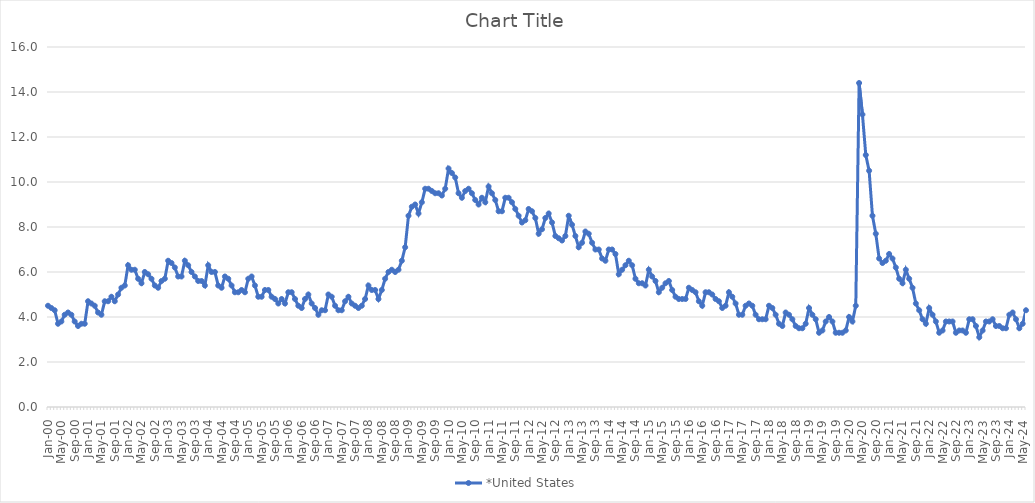
| Category | *United States | Alaska | Alabama | Arkansas | Arizona | California | Colorado | Connecticut | Delaware | Florida | Georgia | Hawaii | Iowa | Idaho | Illinois | Indiana | Kansas | Kentucky | Louisiana | Massachusetts | Maryland | Maine | Michigan | Minnesota | Missouri | Mississippi | Montana | North Carolina | North Dakota | Nebraska | New Hampshire | New Jersey | New Mexico | Nevada | New York | Ohio | Oklahoma | Oregon | Pennsylvania | Rhode Island | South Carolina | South Dakota | Tennessee | Texas | Utah | Virginia | Vermont | Washington | Wisconsin | West Virginia | Wyoming |
|---|---|---|---|---|---|---|---|---|---|---|---|---|---|---|---|---|---|---|---|---|---|---|---|---|---|---|---|---|---|---|---|---|---|---|---|---|---|---|---|---|---|---|---|---|---|---|---|---|---|---|---|
| Jan-00 | 4.5 |  |  |  |  |  |  |  |  |  |  |  |  |  |  |  |  |  |  |  |  |  |  |  |  |  |  |  |  |  |  |  |  |  |  |  |  |  |  |  |  |  |  |  |  |  |  |  |  |  |  |
| Feb-00 | 4.4 |  |  |  |  |  |  |  |  |  |  |  |  |  |  |  |  |  |  |  |  |  |  |  |  |  |  |  |  |  |  |  |  |  |  |  |  |  |  |  |  |  |  |  |  |  |  |  |  |  |  |
| Mar-00 | 4.3 |  |  |  |  |  |  |  |  |  |  |  |  |  |  |  |  |  |  |  |  |  |  |  |  |  |  |  |  |  |  |  |  |  |  |  |  |  |  |  |  |  |  |  |  |  |  |  |  |  |  |
| Apr-00 | 3.7 |  |  |  |  |  |  |  |  |  |  |  |  |  |  |  |  |  |  |  |  |  |  |  |  |  |  |  |  |  |  |  |  |  |  |  |  |  |  |  |  |  |  |  |  |  |  |  |  |  |  |
| May-00 | 3.8 |  |  |  |  |  |  |  |  |  |  |  |  |  |  |  |  |  |  |  |  |  |  |  |  |  |  |  |  |  |  |  |  |  |  |  |  |  |  |  |  |  |  |  |  |  |  |  |  |  |  |
| Jun-00 | 4.1 |  |  |  |  |  |  |  |  |  |  |  |  |  |  |  |  |  |  |  |  |  |  |  |  |  |  |  |  |  |  |  |  |  |  |  |  |  |  |  |  |  |  |  |  |  |  |  |  |  |  |
| Jul-00 | 4.2 |  |  |  |  |  |  |  |  |  |  |  |  |  |  |  |  |  |  |  |  |  |  |  |  |  |  |  |  |  |  |  |  |  |  |  |  |  |  |  |  |  |  |  |  |  |  |  |  |  |  |
| Aug-00 | 4.1 |  |  |  |  |  |  |  |  |  |  |  |  |  |  |  |  |  |  |  |  |  |  |  |  |  |  |  |  |  |  |  |  |  |  |  |  |  |  |  |  |  |  |  |  |  |  |  |  |  |  |
| Sep-00 | 3.8 |  |  |  |  |  |  |  |  |  |  |  |  |  |  |  |  |  |  |  |  |  |  |  |  |  |  |  |  |  |  |  |  |  |  |  |  |  |  |  |  |  |  |  |  |  |  |  |  |  |  |
| Oct-00 | 3.6 |  |  |  |  |  |  |  |  |  |  |  |  |  |  |  |  |  |  |  |  |  |  |  |  |  |  |  |  |  |  |  |  |  |  |  |  |  |  |  |  |  |  |  |  |  |  |  |  |  |  |
| Nov-00 | 3.7 |  |  |  |  |  |  |  |  |  |  |  |  |  |  |  |  |  |  |  |  |  |  |  |  |  |  |  |  |  |  |  |  |  |  |  |  |  |  |  |  |  |  |  |  |  |  |  |  |  |  |
| Dec-00 | 3.7 |  |  |  |  |  |  |  |  |  |  |  |  |  |  |  |  |  |  |  |  |  |  |  |  |  |  |  |  |  |  |  |  |  |  |  |  |  |  |  |  |  |  |  |  |  |  |  |  |  |  |
| Jan-01 | 4.7 |  |  |  |  |  |  |  |  |  |  |  |  |  |  |  |  |  |  |  |  |  |  |  |  |  |  |  |  |  |  |  |  |  |  |  |  |  |  |  |  |  |  |  |  |  |  |  |  |  |  |
| Feb-01 | 4.6 |  |  |  |  |  |  |  |  |  |  |  |  |  |  |  |  |  |  |  |  |  |  |  |  |  |  |  |  |  |  |  |  |  |  |  |  |  |  |  |  |  |  |  |  |  |  |  |  |  |  |
| Mar-01 | 4.5 |  |  |  |  |  |  |  |  |  |  |  |  |  |  |  |  |  |  |  |  |  |  |  |  |  |  |  |  |  |  |  |  |  |  |  |  |  |  |  |  |  |  |  |  |  |  |  |  |  |  |
| Apr-01 | 4.2 |  |  |  |  |  |  |  |  |  |  |  |  |  |  |  |  |  |  |  |  |  |  |  |  |  |  |  |  |  |  |  |  |  |  |  |  |  |  |  |  |  |  |  |  |  |  |  |  |  |  |
| May-01 | 4.1 |  |  |  |  |  |  |  |  |  |  |  |  |  |  |  |  |  |  |  |  |  |  |  |  |  |  |  |  |  |  |  |  |  |  |  |  |  |  |  |  |  |  |  |  |  |  |  |  |  |  |
| Jun-01 | 4.7 |  |  |  |  |  |  |  |  |  |  |  |  |  |  |  |  |  |  |  |  |  |  |  |  |  |  |  |  |  |  |  |  |  |  |  |  |  |  |  |  |  |  |  |  |  |  |  |  |  |  |
| Jul-01 | 4.7 |  |  |  |  |  |  |  |  |  |  |  |  |  |  |  |  |  |  |  |  |  |  |  |  |  |  |  |  |  |  |  |  |  |  |  |  |  |  |  |  |  |  |  |  |  |  |  |  |  |  |
| Aug-01 | 4.9 |  |  |  |  |  |  |  |  |  |  |  |  |  |  |  |  |  |  |  |  |  |  |  |  |  |  |  |  |  |  |  |  |  |  |  |  |  |  |  |  |  |  |  |  |  |  |  |  |  |  |
| Sep-01 | 4.7 |  |  |  |  |  |  |  |  |  |  |  |  |  |  |  |  |  |  |  |  |  |  |  |  |  |  |  |  |  |  |  |  |  |  |  |  |  |  |  |  |  |  |  |  |  |  |  |  |  |  |
| Oct-01 | 5 |  |  |  |  |  |  |  |  |  |  |  |  |  |  |  |  |  |  |  |  |  |  |  |  |  |  |  |  |  |  |  |  |  |  |  |  |  |  |  |  |  |  |  |  |  |  |  |  |  |  |
| Nov-01 | 5.3 |  |  |  |  |  |  |  |  |  |  |  |  |  |  |  |  |  |  |  |  |  |  |  |  |  |  |  |  |  |  |  |  |  |  |  |  |  |  |  |  |  |  |  |  |  |  |  |  |  |  |
| Dec-01 | 5.4 |  |  |  |  |  |  |  |  |  |  |  |  |  |  |  |  |  |  |  |  |  |  |  |  |  |  |  |  |  |  |  |  |  |  |  |  |  |  |  |  |  |  |  |  |  |  |  |  |  |  |
| Jan-02 | 6.3 |  |  |  |  |  |  |  |  |  |  |  |  |  |  |  |  |  |  |  |  |  |  |  |  |  |  |  |  |  |  |  |  |  |  |  |  |  |  |  |  |  |  |  |  |  |  |  |  |  |  |
| Feb-02 | 6.1 |  |  |  |  |  |  |  |  |  |  |  |  |  |  |  |  |  |  |  |  |  |  |  |  |  |  |  |  |  |  |  |  |  |  |  |  |  |  |  |  |  |  |  |  |  |  |  |  |  |  |
| Mar-02 | 6.1 |  |  |  |  |  |  |  |  |  |  |  |  |  |  |  |  |  |  |  |  |  |  |  |  |  |  |  |  |  |  |  |  |  |  |  |  |  |  |  |  |  |  |  |  |  |  |  |  |  |  |
| Apr-02 | 5.7 |  |  |  |  |  |  |  |  |  |  |  |  |  |  |  |  |  |  |  |  |  |  |  |  |  |  |  |  |  |  |  |  |  |  |  |  |  |  |  |  |  |  |  |  |  |  |  |  |  |  |
| May-02 | 5.5 |  |  |  |  |  |  |  |  |  |  |  |  |  |  |  |  |  |  |  |  |  |  |  |  |  |  |  |  |  |  |  |  |  |  |  |  |  |  |  |  |  |  |  |  |  |  |  |  |  |  |
| Jun-02 | 6 |  |  |  |  |  |  |  |  |  |  |  |  |  |  |  |  |  |  |  |  |  |  |  |  |  |  |  |  |  |  |  |  |  |  |  |  |  |  |  |  |  |  |  |  |  |  |  |  |  |  |
| Jul-02 | 5.9 |  |  |  |  |  |  |  |  |  |  |  |  |  |  |  |  |  |  |  |  |  |  |  |  |  |  |  |  |  |  |  |  |  |  |  |  |  |  |  |  |  |  |  |  |  |  |  |  |  |  |
| Aug-02 | 5.7 |  |  |  |  |  |  |  |  |  |  |  |  |  |  |  |  |  |  |  |  |  |  |  |  |  |  |  |  |  |  |  |  |  |  |  |  |  |  |  |  |  |  |  |  |  |  |  |  |  |  |
| Sep-02 | 5.4 |  |  |  |  |  |  |  |  |  |  |  |  |  |  |  |  |  |  |  |  |  |  |  |  |  |  |  |  |  |  |  |  |  |  |  |  |  |  |  |  |  |  |  |  |  |  |  |  |  |  |
| Oct-02 | 5.3 |  |  |  |  |  |  |  |  |  |  |  |  |  |  |  |  |  |  |  |  |  |  |  |  |  |  |  |  |  |  |  |  |  |  |  |  |  |  |  |  |  |  |  |  |  |  |  |  |  |  |
| Nov-02 | 5.6 |  |  |  |  |  |  |  |  |  |  |  |  |  |  |  |  |  |  |  |  |  |  |  |  |  |  |  |  |  |  |  |  |  |  |  |  |  |  |  |  |  |  |  |  |  |  |  |  |  |  |
| Dec-02 | 5.7 |  |  |  |  |  |  |  |  |  |  |  |  |  |  |  |  |  |  |  |  |  |  |  |  |  |  |  |  |  |  |  |  |  |  |  |  |  |  |  |  |  |  |  |  |  |  |  |  |  |  |
| Jan-03 | 6.5 |  |  |  |  |  |  |  |  |  |  |  |  |  |  |  |  |  |  |  |  |  |  |  |  |  |  |  |  |  |  |  |  |  |  |  |  |  |  |  |  |  |  |  |  |  |  |  |  |  |  |
| Feb-03 | 6.4 |  |  |  |  |  |  |  |  |  |  |  |  |  |  |  |  |  |  |  |  |  |  |  |  |  |  |  |  |  |  |  |  |  |  |  |  |  |  |  |  |  |  |  |  |  |  |  |  |  |  |
| Mar-03 | 6.2 |  |  |  |  |  |  |  |  |  |  |  |  |  |  |  |  |  |  |  |  |  |  |  |  |  |  |  |  |  |  |  |  |  |  |  |  |  |  |  |  |  |  |  |  |  |  |  |  |  |  |
| Apr-03 | 5.8 |  |  |  |  |  |  |  |  |  |  |  |  |  |  |  |  |  |  |  |  |  |  |  |  |  |  |  |  |  |  |  |  |  |  |  |  |  |  |  |  |  |  |  |  |  |  |  |  |  |  |
| May-03 | 5.8 |  |  |  |  |  |  |  |  |  |  |  |  |  |  |  |  |  |  |  |  |  |  |  |  |  |  |  |  |  |  |  |  |  |  |  |  |  |  |  |  |  |  |  |  |  |  |  |  |  |  |
| Jun-03 | 6.5 |  |  |  |  |  |  |  |  |  |  |  |  |  |  |  |  |  |  |  |  |  |  |  |  |  |  |  |  |  |  |  |  |  |  |  |  |  |  |  |  |  |  |  |  |  |  |  |  |  |  |
| Jul-03 | 6.3 |  |  |  |  |  |  |  |  |  |  |  |  |  |  |  |  |  |  |  |  |  |  |  |  |  |  |  |  |  |  |  |  |  |  |  |  |  |  |  |  |  |  |  |  |  |  |  |  |  |  |
| Aug-03 | 6 |  |  |  |  |  |  |  |  |  |  |  |  |  |  |  |  |  |  |  |  |  |  |  |  |  |  |  |  |  |  |  |  |  |  |  |  |  |  |  |  |  |  |  |  |  |  |  |  |  |  |
| Sep-03 | 5.8 |  |  |  |  |  |  |  |  |  |  |  |  |  |  |  |  |  |  |  |  |  |  |  |  |  |  |  |  |  |  |  |  |  |  |  |  |  |  |  |  |  |  |  |  |  |  |  |  |  |  |
| Oct-03 | 5.6 |  |  |  |  |  |  |  |  |  |  |  |  |  |  |  |  |  |  |  |  |  |  |  |  |  |  |  |  |  |  |  |  |  |  |  |  |  |  |  |  |  |  |  |  |  |  |  |  |  |  |
| Nov-03 | 5.6 |  |  |  |  |  |  |  |  |  |  |  |  |  |  |  |  |  |  |  |  |  |  |  |  |  |  |  |  |  |  |  |  |  |  |  |  |  |  |  |  |  |  |  |  |  |  |  |  |  |  |
| Dec-03 | 5.4 |  |  |  |  |  |  |  |  |  |  |  |  |  |  |  |  |  |  |  |  |  |  |  |  |  |  |  |  |  |  |  |  |  |  |  |  |  |  |  |  |  |  |  |  |  |  |  |  |  |  |
| Jan-04 | 6.3 |  |  |  |  |  |  |  |  |  |  |  |  |  |  |  |  |  |  |  |  |  |  |  |  |  |  |  |  |  |  |  |  |  |  |  |  |  |  |  |  |  |  |  |  |  |  |  |  |  |  |
| Feb-04 | 6 |  |  |  |  |  |  |  |  |  |  |  |  |  |  |  |  |  |  |  |  |  |  |  |  |  |  |  |  |  |  |  |  |  |  |  |  |  |  |  |  |  |  |  |  |  |  |  |  |  |  |
| Mar-04 | 6 |  |  |  |  |  |  |  |  |  |  |  |  |  |  |  |  |  |  |  |  |  |  |  |  |  |  |  |  |  |  |  |  |  |  |  |  |  |  |  |  |  |  |  |  |  |  |  |  |  |  |
| Apr-04 | 5.4 |  |  |  |  |  |  |  |  |  |  |  |  |  |  |  |  |  |  |  |  |  |  |  |  |  |  |  |  |  |  |  |  |  |  |  |  |  |  |  |  |  |  |  |  |  |  |  |  |  |  |
| May-04 | 5.3 |  |  |  |  |  |  |  |  |  |  |  |  |  |  |  |  |  |  |  |  |  |  |  |  |  |  |  |  |  |  |  |  |  |  |  |  |  |  |  |  |  |  |  |  |  |  |  |  |  |  |
| Jun-04 | 5.8 |  |  |  |  |  |  |  |  |  |  |  |  |  |  |  |  |  |  |  |  |  |  |  |  |  |  |  |  |  |  |  |  |  |  |  |  |  |  |  |  |  |  |  |  |  |  |  |  |  |  |
| Jul-04 | 5.7 |  |  |  |  |  |  |  |  |  |  |  |  |  |  |  |  |  |  |  |  |  |  |  |  |  |  |  |  |  |  |  |  |  |  |  |  |  |  |  |  |  |  |  |  |  |  |  |  |  |  |
| Aug-04 | 5.4 |  |  |  |  |  |  |  |  |  |  |  |  |  |  |  |  |  |  |  |  |  |  |  |  |  |  |  |  |  |  |  |  |  |  |  |  |  |  |  |  |  |  |  |  |  |  |  |  |  |  |
| Sep-04 | 5.1 |  |  |  |  |  |  |  |  |  |  |  |  |  |  |  |  |  |  |  |  |  |  |  |  |  |  |  |  |  |  |  |  |  |  |  |  |  |  |  |  |  |  |  |  |  |  |  |  |  |  |
| Oct-04 | 5.1 |  |  |  |  |  |  |  |  |  |  |  |  |  |  |  |  |  |  |  |  |  |  |  |  |  |  |  |  |  |  |  |  |  |  |  |  |  |  |  |  |  |  |  |  |  |  |  |  |  |  |
| Nov-04 | 5.2 |  |  |  |  |  |  |  |  |  |  |  |  |  |  |  |  |  |  |  |  |  |  |  |  |  |  |  |  |  |  |  |  |  |  |  |  |  |  |  |  |  |  |  |  |  |  |  |  |  |  |
| Dec-04 | 5.1 |  |  |  |  |  |  |  |  |  |  |  |  |  |  |  |  |  |  |  |  |  |  |  |  |  |  |  |  |  |  |  |  |  |  |  |  |  |  |  |  |  |  |  |  |  |  |  |  |  |  |
| Jan-05 | 5.7 |  |  |  |  |  |  |  |  |  |  |  |  |  |  |  |  |  |  |  |  |  |  |  |  |  |  |  |  |  |  |  |  |  |  |  |  |  |  |  |  |  |  |  |  |  |  |  |  |  |  |
| Feb-05 | 5.8 |  |  |  |  |  |  |  |  |  |  |  |  |  |  |  |  |  |  |  |  |  |  |  |  |  |  |  |  |  |  |  |  |  |  |  |  |  |  |  |  |  |  |  |  |  |  |  |  |  |  |
| Mar-05 | 5.4 |  |  |  |  |  |  |  |  |  |  |  |  |  |  |  |  |  |  |  |  |  |  |  |  |  |  |  |  |  |  |  |  |  |  |  |  |  |  |  |  |  |  |  |  |  |  |  |  |  |  |
| Apr-05 | 4.9 |  |  |  |  |  |  |  |  |  |  |  |  |  |  |  |  |  |  |  |  |  |  |  |  |  |  |  |  |  |  |  |  |  |  |  |  |  |  |  |  |  |  |  |  |  |  |  |  |  |  |
| May-05 | 4.9 |  |  |  |  |  |  |  |  |  |  |  |  |  |  |  |  |  |  |  |  |  |  |  |  |  |  |  |  |  |  |  |  |  |  |  |  |  |  |  |  |  |  |  |  |  |  |  |  |  |  |
| Jun-05 | 5.2 |  |  |  |  |  |  |  |  |  |  |  |  |  |  |  |  |  |  |  |  |  |  |  |  |  |  |  |  |  |  |  |  |  |  |  |  |  |  |  |  |  |  |  |  |  |  |  |  |  |  |
| Jul-05 | 5.2 |  |  |  |  |  |  |  |  |  |  |  |  |  |  |  |  |  |  |  |  |  |  |  |  |  |  |  |  |  |  |  |  |  |  |  |  |  |  |  |  |  |  |  |  |  |  |  |  |  |  |
| Aug-05 | 4.9 |  |  |  |  |  |  |  |  |  |  |  |  |  |  |  |  |  |  |  |  |  |  |  |  |  |  |  |  |  |  |  |  |  |  |  |  |  |  |  |  |  |  |  |  |  |  |  |  |  |  |
| Sep-05 | 4.8 |  |  |  |  |  |  |  |  |  |  |  |  |  |  |  |  |  |  |  |  |  |  |  |  |  |  |  |  |  |  |  |  |  |  |  |  |  |  |  |  |  |  |  |  |  |  |  |  |  |  |
| Oct-05 | 4.6 |  |  |  |  |  |  |  |  |  |  |  |  |  |  |  |  |  |  |  |  |  |  |  |  |  |  |  |  |  |  |  |  |  |  |  |  |  |  |  |  |  |  |  |  |  |  |  |  |  |  |
| Nov-05 | 4.8 |  |  |  |  |  |  |  |  |  |  |  |  |  |  |  |  |  |  |  |  |  |  |  |  |  |  |  |  |  |  |  |  |  |  |  |  |  |  |  |  |  |  |  |  |  |  |  |  |  |  |
| Dec-05 | 4.6 |  |  |  |  |  |  |  |  |  |  |  |  |  |  |  |  |  |  |  |  |  |  |  |  |  |  |  |  |  |  |  |  |  |  |  |  |  |  |  |  |  |  |  |  |  |  |  |  |  |  |
| Jan-06 | 5.1 |  |  |  |  |  |  |  |  |  |  |  |  |  |  |  |  |  |  |  |  |  |  |  |  |  |  |  |  |  |  |  |  |  |  |  |  |  |  |  |  |  |  |  |  |  |  |  |  |  |  |
| Feb-06 | 5.1 |  |  |  |  |  |  |  |  |  |  |  |  |  |  |  |  |  |  |  |  |  |  |  |  |  |  |  |  |  |  |  |  |  |  |  |  |  |  |  |  |  |  |  |  |  |  |  |  |  |  |
| Mar-06 | 4.8 |  |  |  |  |  |  |  |  |  |  |  |  |  |  |  |  |  |  |  |  |  |  |  |  |  |  |  |  |  |  |  |  |  |  |  |  |  |  |  |  |  |  |  |  |  |  |  |  |  |  |
| Apr-06 | 4.5 |  |  |  |  |  |  |  |  |  |  |  |  |  |  |  |  |  |  |  |  |  |  |  |  |  |  |  |  |  |  |  |  |  |  |  |  |  |  |  |  |  |  |  |  |  |  |  |  |  |  |
| May-06 | 4.4 |  |  |  |  |  |  |  |  |  |  |  |  |  |  |  |  |  |  |  |  |  |  |  |  |  |  |  |  |  |  |  |  |  |  |  |  |  |  |  |  |  |  |  |  |  |  |  |  |  |  |
| Jun-06 | 4.8 |  |  |  |  |  |  |  |  |  |  |  |  |  |  |  |  |  |  |  |  |  |  |  |  |  |  |  |  |  |  |  |  |  |  |  |  |  |  |  |  |  |  |  |  |  |  |  |  |  |  |
| Jul-06 | 5 |  |  |  |  |  |  |  |  |  |  |  |  |  |  |  |  |  |  |  |  |  |  |  |  |  |  |  |  |  |  |  |  |  |  |  |  |  |  |  |  |  |  |  |  |  |  |  |  |  |  |
| Aug-06 | 4.6 |  |  |  |  |  |  |  |  |  |  |  |  |  |  |  |  |  |  |  |  |  |  |  |  |  |  |  |  |  |  |  |  |  |  |  |  |  |  |  |  |  |  |  |  |  |  |  |  |  |  |
| Sep-06 | 4.4 |  |  |  |  |  |  |  |  |  |  |  |  |  |  |  |  |  |  |  |  |  |  |  |  |  |  |  |  |  |  |  |  |  |  |  |  |  |  |  |  |  |  |  |  |  |  |  |  |  |  |
| Oct-06 | 4.1 |  |  |  |  |  |  |  |  |  |  |  |  |  |  |  |  |  |  |  |  |  |  |  |  |  |  |  |  |  |  |  |  |  |  |  |  |  |  |  |  |  |  |  |  |  |  |  |  |  |  |
| Nov-06 | 4.3 |  |  |  |  |  |  |  |  |  |  |  |  |  |  |  |  |  |  |  |  |  |  |  |  |  |  |  |  |  |  |  |  |  |  |  |  |  |  |  |  |  |  |  |  |  |  |  |  |  |  |
| Dec-06 | 4.3 |  |  |  |  |  |  |  |  |  |  |  |  |  |  |  |  |  |  |  |  |  |  |  |  |  |  |  |  |  |  |  |  |  |  |  |  |  |  |  |  |  |  |  |  |  |  |  |  |  |  |
| Jan-07 | 5 |  |  |  |  |  |  |  |  |  |  |  |  |  |  |  |  |  |  |  |  |  |  |  |  |  |  |  |  |  |  |  |  |  |  |  |  |  |  |  |  |  |  |  |  |  |  |  |  |  |  |
| Feb-07 | 4.9 |  |  |  |  |  |  |  |  |  |  |  |  |  |  |  |  |  |  |  |  |  |  |  |  |  |  |  |  |  |  |  |  |  |  |  |  |  |  |  |  |  |  |  |  |  |  |  |  |  |  |
| Mar-07 | 4.5 |  |  |  |  |  |  |  |  |  |  |  |  |  |  |  |  |  |  |  |  |  |  |  |  |  |  |  |  |  |  |  |  |  |  |  |  |  |  |  |  |  |  |  |  |  |  |  |  |  |  |
| Apr-07 | 4.3 |  |  |  |  |  |  |  |  |  |  |  |  |  |  |  |  |  |  |  |  |  |  |  |  |  |  |  |  |  |  |  |  |  |  |  |  |  |  |  |  |  |  |  |  |  |  |  |  |  |  |
| May-07 | 4.3 |  |  |  |  |  |  |  |  |  |  |  |  |  |  |  |  |  |  |  |  |  |  |  |  |  |  |  |  |  |  |  |  |  |  |  |  |  |  |  |  |  |  |  |  |  |  |  |  |  |  |
| Jun-07 | 4.7 |  |  |  |  |  |  |  |  |  |  |  |  |  |  |  |  |  |  |  |  |  |  |  |  |  |  |  |  |  |  |  |  |  |  |  |  |  |  |  |  |  |  |  |  |  |  |  |  |  |  |
| Jul-07 | 4.9 |  |  |  |  |  |  |  |  |  |  |  |  |  |  |  |  |  |  |  |  |  |  |  |  |  |  |  |  |  |  |  |  |  |  |  |  |  |  |  |  |  |  |  |  |  |  |  |  |  |  |
| Aug-07 | 4.6 |  |  |  |  |  |  |  |  |  |  |  |  |  |  |  |  |  |  |  |  |  |  |  |  |  |  |  |  |  |  |  |  |  |  |  |  |  |  |  |  |  |  |  |  |  |  |  |  |  |  |
| Sep-07 | 4.5 |  |  |  |  |  |  |  |  |  |  |  |  |  |  |  |  |  |  |  |  |  |  |  |  |  |  |  |  |  |  |  |  |  |  |  |  |  |  |  |  |  |  |  |  |  |  |  |  |  |  |
| Oct-07 | 4.4 |  |  |  |  |  |  |  |  |  |  |  |  |  |  |  |  |  |  |  |  |  |  |  |  |  |  |  |  |  |  |  |  |  |  |  |  |  |  |  |  |  |  |  |  |  |  |  |  |  |  |
| Nov-07 | 4.5 |  |  |  |  |  |  |  |  |  |  |  |  |  |  |  |  |  |  |  |  |  |  |  |  |  |  |  |  |  |  |  |  |  |  |  |  |  |  |  |  |  |  |  |  |  |  |  |  |  |  |
| Dec-07 | 4.8 |  |  |  |  |  |  |  |  |  |  |  |  |  |  |  |  |  |  |  |  |  |  |  |  |  |  |  |  |  |  |  |  |  |  |  |  |  |  |  |  |  |  |  |  |  |  |  |  |  |  |
| Jan-08 | 5.4 |  |  |  |  |  |  |  |  |  |  |  |  |  |  |  |  |  |  |  |  |  |  |  |  |  |  |  |  |  |  |  |  |  |  |  |  |  |  |  |  |  |  |  |  |  |  |  |  |  |  |
| Feb-08 | 5.2 |  |  |  |  |  |  |  |  |  |  |  |  |  |  |  |  |  |  |  |  |  |  |  |  |  |  |  |  |  |  |  |  |  |  |  |  |  |  |  |  |  |  |  |  |  |  |  |  |  |  |
| Mar-08 | 5.2 |  |  |  |  |  |  |  |  |  |  |  |  |  |  |  |  |  |  |  |  |  |  |  |  |  |  |  |  |  |  |  |  |  |  |  |  |  |  |  |  |  |  |  |  |  |  |  |  |  |  |
| Apr-08 | 4.8 |  |  |  |  |  |  |  |  |  |  |  |  |  |  |  |  |  |  |  |  |  |  |  |  |  |  |  |  |  |  |  |  |  |  |  |  |  |  |  |  |  |  |  |  |  |  |  |  |  |  |
| May-08 | 5.2 |  |  |  |  |  |  |  |  |  |  |  |  |  |  |  |  |  |  |  |  |  |  |  |  |  |  |  |  |  |  |  |  |  |  |  |  |  |  |  |  |  |  |  |  |  |  |  |  |  |  |
| Jun-08 | 5.7 |  |  |  |  |  |  |  |  |  |  |  |  |  |  |  |  |  |  |  |  |  |  |  |  |  |  |  |  |  |  |  |  |  |  |  |  |  |  |  |  |  |  |  |  |  |  |  |  |  |  |
| Jul-08 | 6 |  |  |  |  |  |  |  |  |  |  |  |  |  |  |  |  |  |  |  |  |  |  |  |  |  |  |  |  |  |  |  |  |  |  |  |  |  |  |  |  |  |  |  |  |  |  |  |  |  |  |
| Aug-08 | 6.1 |  |  |  |  |  |  |  |  |  |  |  |  |  |  |  |  |  |  |  |  |  |  |  |  |  |  |  |  |  |  |  |  |  |  |  |  |  |  |  |  |  |  |  |  |  |  |  |  |  |  |
| Sep-08 | 6 |  |  |  |  |  |  |  |  |  |  |  |  |  |  |  |  |  |  |  |  |  |  |  |  |  |  |  |  |  |  |  |  |  |  |  |  |  |  |  |  |  |  |  |  |  |  |  |  |  |  |
| Oct-08 | 6.1 |  |  |  |  |  |  |  |  |  |  |  |  |  |  |  |  |  |  |  |  |  |  |  |  |  |  |  |  |  |  |  |  |  |  |  |  |  |  |  |  |  |  |  |  |  |  |  |  |  |  |
| Nov-08 | 6.5 |  |  |  |  |  |  |  |  |  |  |  |  |  |  |  |  |  |  |  |  |  |  |  |  |  |  |  |  |  |  |  |  |  |  |  |  |  |  |  |  |  |  |  |  |  |  |  |  |  |  |
| Dec-08 | 7.1 |  |  |  |  |  |  |  |  |  |  |  |  |  |  |  |  |  |  |  |  |  |  |  |  |  |  |  |  |  |  |  |  |  |  |  |  |  |  |  |  |  |  |  |  |  |  |  |  |  |  |
| Jan-09 | 8.5 |  |  |  |  |  |  |  |  |  |  |  |  |  |  |  |  |  |  |  |  |  |  |  |  |  |  |  |  |  |  |  |  |  |  |  |  |  |  |  |  |  |  |  |  |  |  |  |  |  |  |
| Feb-09 | 8.9 |  |  |  |  |  |  |  |  |  |  |  |  |  |  |  |  |  |  |  |  |  |  |  |  |  |  |  |  |  |  |  |  |  |  |  |  |  |  |  |  |  |  |  |  |  |  |  |  |  |  |
| Mar-09 | 9 |  |  |  |  |  |  |  |  |  |  |  |  |  |  |  |  |  |  |  |  |  |  |  |  |  |  |  |  |  |  |  |  |  |  |  |  |  |  |  |  |  |  |  |  |  |  |  |  |  |  |
| Apr-09 | 8.6 |  |  |  |  |  |  |  |  |  |  |  |  |  |  |  |  |  |  |  |  |  |  |  |  |  |  |  |  |  |  |  |  |  |  |  |  |  |  |  |  |  |  |  |  |  |  |  |  |  |  |
| May-09 | 9.1 |  |  |  |  |  |  |  |  |  |  |  |  |  |  |  |  |  |  |  |  |  |  |  |  |  |  |  |  |  |  |  |  |  |  |  |  |  |  |  |  |  |  |  |  |  |  |  |  |  |  |
| Jun-09 | 9.7 |  |  |  |  |  |  |  |  |  |  |  |  |  |  |  |  |  |  |  |  |  |  |  |  |  |  |  |  |  |  |  |  |  |  |  |  |  |  |  |  |  |  |  |  |  |  |  |  |  |  |
| Jul-09 | 9.7 |  |  |  |  |  |  |  |  |  |  |  |  |  |  |  |  |  |  |  |  |  |  |  |  |  |  |  |  |  |  |  |  |  |  |  |  |  |  |  |  |  |  |  |  |  |  |  |  |  |  |
| Aug-09 | 9.6 |  |  |  |  |  |  |  |  |  |  |  |  |  |  |  |  |  |  |  |  |  |  |  |  |  |  |  |  |  |  |  |  |  |  |  |  |  |  |  |  |  |  |  |  |  |  |  |  |  |  |
| Sep-09 | 9.5 |  |  |  |  |  |  |  |  |  |  |  |  |  |  |  |  |  |  |  |  |  |  |  |  |  |  |  |  |  |  |  |  |  |  |  |  |  |  |  |  |  |  |  |  |  |  |  |  |  |  |
| Oct-09 | 9.5 |  |  |  |  |  |  |  |  |  |  |  |  |  |  |  |  |  |  |  |  |  |  |  |  |  |  |  |  |  |  |  |  |  |  |  |  |  |  |  |  |  |  |  |  |  |  |  |  |  |  |
| Nov-09 | 9.4 |  |  |  |  |  |  |  |  |  |  |  |  |  |  |  |  |  |  |  |  |  |  |  |  |  |  |  |  |  |  |  |  |  |  |  |  |  |  |  |  |  |  |  |  |  |  |  |  |  |  |
| Dec-09 | 9.7 |  |  |  |  |  |  |  |  |  |  |  |  |  |  |  |  |  |  |  |  |  |  |  |  |  |  |  |  |  |  |  |  |  |  |  |  |  |  |  |  |  |  |  |  |  |  |  |  |  |  |
| Jan-10 | 10.6 |  |  |  |  |  |  |  |  |  |  |  |  |  |  |  |  |  |  |  |  |  |  |  |  |  |  |  |  |  |  |  |  |  |  |  |  |  |  |  |  |  |  |  |  |  |  |  |  |  |  |
| Feb-10 | 10.4 |  |  |  |  |  |  |  |  |  |  |  |  |  |  |  |  |  |  |  |  |  |  |  |  |  |  |  |  |  |  |  |  |  |  |  |  |  |  |  |  |  |  |  |  |  |  |  |  |  |  |
| Mar-10 | 10.2 |  |  |  |  |  |  |  |  |  |  |  |  |  |  |  |  |  |  |  |  |  |  |  |  |  |  |  |  |  |  |  |  |  |  |  |  |  |  |  |  |  |  |  |  |  |  |  |  |  |  |
| Apr-10 | 9.5 |  |  |  |  |  |  |  |  |  |  |  |  |  |  |  |  |  |  |  |  |  |  |  |  |  |  |  |  |  |  |  |  |  |  |  |  |  |  |  |  |  |  |  |  |  |  |  |  |  |  |
| May-10 | 9.3 |  |  |  |  |  |  |  |  |  |  |  |  |  |  |  |  |  |  |  |  |  |  |  |  |  |  |  |  |  |  |  |  |  |  |  |  |  |  |  |  |  |  |  |  |  |  |  |  |  |  |
| Jun-10 | 9.6 |  |  |  |  |  |  |  |  |  |  |  |  |  |  |  |  |  |  |  |  |  |  |  |  |  |  |  |  |  |  |  |  |  |  |  |  |  |  |  |  |  |  |  |  |  |  |  |  |  |  |
| Jul-10 | 9.7 |  |  |  |  |  |  |  |  |  |  |  |  |  |  |  |  |  |  |  |  |  |  |  |  |  |  |  |  |  |  |  |  |  |  |  |  |  |  |  |  |  |  |  |  |  |  |  |  |  |  |
| Aug-10 | 9.5 |  |  |  |  |  |  |  |  |  |  |  |  |  |  |  |  |  |  |  |  |  |  |  |  |  |  |  |  |  |  |  |  |  |  |  |  |  |  |  |  |  |  |  |  |  |  |  |  |  |  |
| Sep-10 | 9.2 |  |  |  |  |  |  |  |  |  |  |  |  |  |  |  |  |  |  |  |  |  |  |  |  |  |  |  |  |  |  |  |  |  |  |  |  |  |  |  |  |  |  |  |  |  |  |  |  |  |  |
| Oct-10 | 9 |  |  |  |  |  |  |  |  |  |  |  |  |  |  |  |  |  |  |  |  |  |  |  |  |  |  |  |  |  |  |  |  |  |  |  |  |  |  |  |  |  |  |  |  |  |  |  |  |  |  |
| Nov-10 | 9.3 |  |  |  |  |  |  |  |  |  |  |  |  |  |  |  |  |  |  |  |  |  |  |  |  |  |  |  |  |  |  |  |  |  |  |  |  |  |  |  |  |  |  |  |  |  |  |  |  |  |  |
| Dec-10 | 9.1 |  |  |  |  |  |  |  |  |  |  |  |  |  |  |  |  |  |  |  |  |  |  |  |  |  |  |  |  |  |  |  |  |  |  |  |  |  |  |  |  |  |  |  |  |  |  |  |  |  |  |
| Jan-11 | 9.8 |  |  |  |  |  |  |  |  |  |  |  |  |  |  |  |  |  |  |  |  |  |  |  |  |  |  |  |  |  |  |  |  |  |  |  |  |  |  |  |  |  |  |  |  |  |  |  |  |  |  |
| Feb-11 | 9.5 |  |  |  |  |  |  |  |  |  |  |  |  |  |  |  |  |  |  |  |  |  |  |  |  |  |  |  |  |  |  |  |  |  |  |  |  |  |  |  |  |  |  |  |  |  |  |  |  |  |  |
| Mar-11 | 9.2 |  |  |  |  |  |  |  |  |  |  |  |  |  |  |  |  |  |  |  |  |  |  |  |  |  |  |  |  |  |  |  |  |  |  |  |  |  |  |  |  |  |  |  |  |  |  |  |  |  |  |
| Apr-11 | 8.7 |  |  |  |  |  |  |  |  |  |  |  |  |  |  |  |  |  |  |  |  |  |  |  |  |  |  |  |  |  |  |  |  |  |  |  |  |  |  |  |  |  |  |  |  |  |  |  |  |  |  |
| May-11 | 8.7 |  |  |  |  |  |  |  |  |  |  |  |  |  |  |  |  |  |  |  |  |  |  |  |  |  |  |  |  |  |  |  |  |  |  |  |  |  |  |  |  |  |  |  |  |  |  |  |  |  |  |
| Jun-11 | 9.3 |  |  |  |  |  |  |  |  |  |  |  |  |  |  |  |  |  |  |  |  |  |  |  |  |  |  |  |  |  |  |  |  |  |  |  |  |  |  |  |  |  |  |  |  |  |  |  |  |  |  |
| Jul-11 | 9.3 |  |  |  |  |  |  |  |  |  |  |  |  |  |  |  |  |  |  |  |  |  |  |  |  |  |  |  |  |  |  |  |  |  |  |  |  |  |  |  |  |  |  |  |  |  |  |  |  |  |  |
| Aug-11 | 9.1 |  |  |  |  |  |  |  |  |  |  |  |  |  |  |  |  |  |  |  |  |  |  |  |  |  |  |  |  |  |  |  |  |  |  |  |  |  |  |  |  |  |  |  |  |  |  |  |  |  |  |
| Sep-11 | 8.8 |  |  |  |  |  |  |  |  |  |  |  |  |  |  |  |  |  |  |  |  |  |  |  |  |  |  |  |  |  |  |  |  |  |  |  |  |  |  |  |  |  |  |  |  |  |  |  |  |  |  |
| Oct-11 | 8.5 |  |  |  |  |  |  |  |  |  |  |  |  |  |  |  |  |  |  |  |  |  |  |  |  |  |  |  |  |  |  |  |  |  |  |  |  |  |  |  |  |  |  |  |  |  |  |  |  |  |  |
| Nov-11 | 8.2 |  |  |  |  |  |  |  |  |  |  |  |  |  |  |  |  |  |  |  |  |  |  |  |  |  |  |  |  |  |  |  |  |  |  |  |  |  |  |  |  |  |  |  |  |  |  |  |  |  |  |
| Dec-11 | 8.3 |  |  |  |  |  |  |  |  |  |  |  |  |  |  |  |  |  |  |  |  |  |  |  |  |  |  |  |  |  |  |  |  |  |  |  |  |  |  |  |  |  |  |  |  |  |  |  |  |  |  |
| Jan-12 | 8.8 |  |  |  |  |  |  |  |  |  |  |  |  |  |  |  |  |  |  |  |  |  |  |  |  |  |  |  |  |  |  |  |  |  |  |  |  |  |  |  |  |  |  |  |  |  |  |  |  |  |  |
| Feb-12 | 8.7 |  |  |  |  |  |  |  |  |  |  |  |  |  |  |  |  |  |  |  |  |  |  |  |  |  |  |  |  |  |  |  |  |  |  |  |  |  |  |  |  |  |  |  |  |  |  |  |  |  |  |
| Mar-12 | 8.4 |  |  |  |  |  |  |  |  |  |  |  |  |  |  |  |  |  |  |  |  |  |  |  |  |  |  |  |  |  |  |  |  |  |  |  |  |  |  |  |  |  |  |  |  |  |  |  |  |  |  |
| Apr-12 | 7.7 |  |  |  |  |  |  |  |  |  |  |  |  |  |  |  |  |  |  |  |  |  |  |  |  |  |  |  |  |  |  |  |  |  |  |  |  |  |  |  |  |  |  |  |  |  |  |  |  |  |  |
| May-12 | 7.9 |  |  |  |  |  |  |  |  |  |  |  |  |  |  |  |  |  |  |  |  |  |  |  |  |  |  |  |  |  |  |  |  |  |  |  |  |  |  |  |  |  |  |  |  |  |  |  |  |  |  |
| Jun-12 | 8.4 |  |  |  |  |  |  |  |  |  |  |  |  |  |  |  |  |  |  |  |  |  |  |  |  |  |  |  |  |  |  |  |  |  |  |  |  |  |  |  |  |  |  |  |  |  |  |  |  |  |  |
| Jul-12 | 8.6 |  |  |  |  |  |  |  |  |  |  |  |  |  |  |  |  |  |  |  |  |  |  |  |  |  |  |  |  |  |  |  |  |  |  |  |  |  |  |  |  |  |  |  |  |  |  |  |  |  |  |
| Aug-12 | 8.2 |  |  |  |  |  |  |  |  |  |  |  |  |  |  |  |  |  |  |  |  |  |  |  |  |  |  |  |  |  |  |  |  |  |  |  |  |  |  |  |  |  |  |  |  |  |  |  |  |  |  |
| Sep-12 | 7.6 |  |  |  |  |  |  |  |  |  |  |  |  |  |  |  |  |  |  |  |  |  |  |  |  |  |  |  |  |  |  |  |  |  |  |  |  |  |  |  |  |  |  |  |  |  |  |  |  |  |  |
| Oct-12 | 7.5 |  |  |  |  |  |  |  |  |  |  |  |  |  |  |  |  |  |  |  |  |  |  |  |  |  |  |  |  |  |  |  |  |  |  |  |  |  |  |  |  |  |  |  |  |  |  |  |  |  |  |
| Nov-12 | 7.4 |  |  |  |  |  |  |  |  |  |  |  |  |  |  |  |  |  |  |  |  |  |  |  |  |  |  |  |  |  |  |  |  |  |  |  |  |  |  |  |  |  |  |  |  |  |  |  |  |  |  |
| Dec-12 | 7.6 |  |  |  |  |  |  |  |  |  |  |  |  |  |  |  |  |  |  |  |  |  |  |  |  |  |  |  |  |  |  |  |  |  |  |  |  |  |  |  |  |  |  |  |  |  |  |  |  |  |  |
| Jan-13 | 8.5 |  |  |  |  |  |  |  |  |  |  |  |  |  |  |  |  |  |  |  |  |  |  |  |  |  |  |  |  |  |  |  |  |  |  |  |  |  |  |  |  |  |  |  |  |  |  |  |  |  |  |
| Feb-13 | 8.1 |  |  |  |  |  |  |  |  |  |  |  |  |  |  |  |  |  |  |  |  |  |  |  |  |  |  |  |  |  |  |  |  |  |  |  |  |  |  |  |  |  |  |  |  |  |  |  |  |  |  |
| Mar-13 | 7.6 |  |  |  |  |  |  |  |  |  |  |  |  |  |  |  |  |  |  |  |  |  |  |  |  |  |  |  |  |  |  |  |  |  |  |  |  |  |  |  |  |  |  |  |  |  |  |  |  |  |  |
| Apr-13 | 7.1 |  |  |  |  |  |  |  |  |  |  |  |  |  |  |  |  |  |  |  |  |  |  |  |  |  |  |  |  |  |  |  |  |  |  |  |  |  |  |  |  |  |  |  |  |  |  |  |  |  |  |
| May-13 | 7.3 |  |  |  |  |  |  |  |  |  |  |  |  |  |  |  |  |  |  |  |  |  |  |  |  |  |  |  |  |  |  |  |  |  |  |  |  |  |  |  |  |  |  |  |  |  |  |  |  |  |  |
| Jun-13 | 7.8 |  |  |  |  |  |  |  |  |  |  |  |  |  |  |  |  |  |  |  |  |  |  |  |  |  |  |  |  |  |  |  |  |  |  |  |  |  |  |  |  |  |  |  |  |  |  |  |  |  |  |
| Jul-13 | 7.7 |  |  |  |  |  |  |  |  |  |  |  |  |  |  |  |  |  |  |  |  |  |  |  |  |  |  |  |  |  |  |  |  |  |  |  |  |  |  |  |  |  |  |  |  |  |  |  |  |  |  |
| Aug-13 | 7.3 |  |  |  |  |  |  |  |  |  |  |  |  |  |  |  |  |  |  |  |  |  |  |  |  |  |  |  |  |  |  |  |  |  |  |  |  |  |  |  |  |  |  |  |  |  |  |  |  |  |  |
| Sep-13 | 7 |  |  |  |  |  |  |  |  |  |  |  |  |  |  |  |  |  |  |  |  |  |  |  |  |  |  |  |  |  |  |  |  |  |  |  |  |  |  |  |  |  |  |  |  |  |  |  |  |  |  |
| Oct-13 | 7 |  |  |  |  |  |  |  |  |  |  |  |  |  |  |  |  |  |  |  |  |  |  |  |  |  |  |  |  |  |  |  |  |  |  |  |  |  |  |  |  |  |  |  |  |  |  |  |  |  |  |
| Nov-13 | 6.6 |  |  |  |  |  |  |  |  |  |  |  |  |  |  |  |  |  |  |  |  |  |  |  |  |  |  |  |  |  |  |  |  |  |  |  |  |  |  |  |  |  |  |  |  |  |  |  |  |  |  |
| Dec-13 | 6.5 |  |  |  |  |  |  |  |  |  |  |  |  |  |  |  |  |  |  |  |  |  |  |  |  |  |  |  |  |  |  |  |  |  |  |  |  |  |  |  |  |  |  |  |  |  |  |  |  |  |  |
| Jan-14 | 7 |  |  |  |  |  |  |  |  |  |  |  |  |  |  |  |  |  |  |  |  |  |  |  |  |  |  |  |  |  |  |  |  |  |  |  |  |  |  |  |  |  |  |  |  |  |  |  |  |  |  |
| Feb-14 | 7 |  |  |  |  |  |  |  |  |  |  |  |  |  |  |  |  |  |  |  |  |  |  |  |  |  |  |  |  |  |  |  |  |  |  |  |  |  |  |  |  |  |  |  |  |  |  |  |  |  |  |
| Mar-14 | 6.8 |  |  |  |  |  |  |  |  |  |  |  |  |  |  |  |  |  |  |  |  |  |  |  |  |  |  |  |  |  |  |  |  |  |  |  |  |  |  |  |  |  |  |  |  |  |  |  |  |  |  |
| Apr-14 | 5.9 |  |  |  |  |  |  |  |  |  |  |  |  |  |  |  |  |  |  |  |  |  |  |  |  |  |  |  |  |  |  |  |  |  |  |  |  |  |  |  |  |  |  |  |  |  |  |  |  |  |  |
| May-14 | 6.1 |  |  |  |  |  |  |  |  |  |  |  |  |  |  |  |  |  |  |  |  |  |  |  |  |  |  |  |  |  |  |  |  |  |  |  |  |  |  |  |  |  |  |  |  |  |  |  |  |  |  |
| Jun-14 | 6.3 |  |  |  |  |  |  |  |  |  |  |  |  |  |  |  |  |  |  |  |  |  |  |  |  |  |  |  |  |  |  |  |  |  |  |  |  |  |  |  |  |  |  |  |  |  |  |  |  |  |  |
| Jul-14 | 6.5 |  |  |  |  |  |  |  |  |  |  |  |  |  |  |  |  |  |  |  |  |  |  |  |  |  |  |  |  |  |  |  |  |  |  |  |  |  |  |  |  |  |  |  |  |  |  |  |  |  |  |
| Aug-14 | 6.3 |  |  |  |  |  |  |  |  |  |  |  |  |  |  |  |  |  |  |  |  |  |  |  |  |  |  |  |  |  |  |  |  |  |  |  |  |  |  |  |  |  |  |  |  |  |  |  |  |  |  |
| Sep-14 | 5.7 |  |  |  |  |  |  |  |  |  |  |  |  |  |  |  |  |  |  |  |  |  |  |  |  |  |  |  |  |  |  |  |  |  |  |  |  |  |  |  |  |  |  |  |  |  |  |  |  |  |  |
| Oct-14 | 5.5 |  |  |  |  |  |  |  |  |  |  |  |  |  |  |  |  |  |  |  |  |  |  |  |  |  |  |  |  |  |  |  |  |  |  |  |  |  |  |  |  |  |  |  |  |  |  |  |  |  |  |
| Nov-14 | 5.5 |  |  |  |  |  |  |  |  |  |  |  |  |  |  |  |  |  |  |  |  |  |  |  |  |  |  |  |  |  |  |  |  |  |  |  |  |  |  |  |  |  |  |  |  |  |  |  |  |  |  |
| Dec-14 | 5.4 |  |  |  |  |  |  |  |  |  |  |  |  |  |  |  |  |  |  |  |  |  |  |  |  |  |  |  |  |  |  |  |  |  |  |  |  |  |  |  |  |  |  |  |  |  |  |  |  |  |  |
| Jan-15 | 6.1 |  |  |  |  |  |  |  |  |  |  |  |  |  |  |  |  |  |  |  |  |  |  |  |  |  |  |  |  |  |  |  |  |  |  |  |  |  |  |  |  |  |  |  |  |  |  |  |  |  |  |
| Feb-15 | 5.8 |  |  |  |  |  |  |  |  |  |  |  |  |  |  |  |  |  |  |  |  |  |  |  |  |  |  |  |  |  |  |  |  |  |  |  |  |  |  |  |  |  |  |  |  |  |  |  |  |  |  |
| Mar-15 | 5.6 |  |  |  |  |  |  |  |  |  |  |  |  |  |  |  |  |  |  |  |  |  |  |  |  |  |  |  |  |  |  |  |  |  |  |  |  |  |  |  |  |  |  |  |  |  |  |  |  |  |  |
| Apr-15 | 5.1 |  |  |  |  |  |  |  |  |  |  |  |  |  |  |  |  |  |  |  |  |  |  |  |  |  |  |  |  |  |  |  |  |  |  |  |  |  |  |  |  |  |  |  |  |  |  |  |  |  |  |
| May-15 | 5.3 |  |  |  |  |  |  |  |  |  |  |  |  |  |  |  |  |  |  |  |  |  |  |  |  |  |  |  |  |  |  |  |  |  |  |  |  |  |  |  |  |  |  |  |  |  |  |  |  |  |  |
| Jun-15 | 5.5 |  |  |  |  |  |  |  |  |  |  |  |  |  |  |  |  |  |  |  |  |  |  |  |  |  |  |  |  |  |  |  |  |  |  |  |  |  |  |  |  |  |  |  |  |  |  |  |  |  |  |
| Jul-15 | 5.6 |  |  |  |  |  |  |  |  |  |  |  |  |  |  |  |  |  |  |  |  |  |  |  |  |  |  |  |  |  |  |  |  |  |  |  |  |  |  |  |  |  |  |  |  |  |  |  |  |  |  |
| Aug-15 | 5.2 |  |  |  |  |  |  |  |  |  |  |  |  |  |  |  |  |  |  |  |  |  |  |  |  |  |  |  |  |  |  |  |  |  |  |  |  |  |  |  |  |  |  |  |  |  |  |  |  |  |  |
| Sep-15 | 4.9 |  |  |  |  |  |  |  |  |  |  |  |  |  |  |  |  |  |  |  |  |  |  |  |  |  |  |  |  |  |  |  |  |  |  |  |  |  |  |  |  |  |  |  |  |  |  |  |  |  |  |
| Oct-15 | 4.8 |  |  |  |  |  |  |  |  |  |  |  |  |  |  |  |  |  |  |  |  |  |  |  |  |  |  |  |  |  |  |  |  |  |  |  |  |  |  |  |  |  |  |  |  |  |  |  |  |  |  |
| Nov-15 | 4.8 |  |  |  |  |  |  |  |  |  |  |  |  |  |  |  |  |  |  |  |  |  |  |  |  |  |  |  |  |  |  |  |  |  |  |  |  |  |  |  |  |  |  |  |  |  |  |  |  |  |  |
| Dec-15 | 4.8 |  |  |  |  |  |  |  |  |  |  |  |  |  |  |  |  |  |  |  |  |  |  |  |  |  |  |  |  |  |  |  |  |  |  |  |  |  |  |  |  |  |  |  |  |  |  |  |  |  |  |
| Jan-16 | 5.3 |  |  |  |  |  |  |  |  |  |  |  |  |  |  |  |  |  |  |  |  |  |  |  |  |  |  |  |  |  |  |  |  |  |  |  |  |  |  |  |  |  |  |  |  |  |  |  |  |  |  |
| Feb-16 | 5.2 |  |  |  |  |  |  |  |  |  |  |  |  |  |  |  |  |  |  |  |  |  |  |  |  |  |  |  |  |  |  |  |  |  |  |  |  |  |  |  |  |  |  |  |  |  |  |  |  |  |  |
| Mar-16 | 5.1 |  |  |  |  |  |  |  |  |  |  |  |  |  |  |  |  |  |  |  |  |  |  |  |  |  |  |  |  |  |  |  |  |  |  |  |  |  |  |  |  |  |  |  |  |  |  |  |  |  |  |
| Apr-16 | 4.7 |  |  |  |  |  |  |  |  |  |  |  |  |  |  |  |  |  |  |  |  |  |  |  |  |  |  |  |  |  |  |  |  |  |  |  |  |  |  |  |  |  |  |  |  |  |  |  |  |  |  |
| May-16 | 4.5 |  |  |  |  |  |  |  |  |  |  |  |  |  |  |  |  |  |  |  |  |  |  |  |  |  |  |  |  |  |  |  |  |  |  |  |  |  |  |  |  |  |  |  |  |  |  |  |  |  |  |
| Jun-16 | 5.1 |  |  |  |  |  |  |  |  |  |  |  |  |  |  |  |  |  |  |  |  |  |  |  |  |  |  |  |  |  |  |  |  |  |  |  |  |  |  |  |  |  |  |  |  |  |  |  |  |  |  |
| Jul-16 | 5.1 |  |  |  |  |  |  |  |  |  |  |  |  |  |  |  |  |  |  |  |  |  |  |  |  |  |  |  |  |  |  |  |  |  |  |  |  |  |  |  |  |  |  |  |  |  |  |  |  |  |  |
| Aug-16 | 5 |  |  |  |  |  |  |  |  |  |  |  |  |  |  |  |  |  |  |  |  |  |  |  |  |  |  |  |  |  |  |  |  |  |  |  |  |  |  |  |  |  |  |  |  |  |  |  |  |  |  |
| Sep-16 | 4.8 |  |  |  |  |  |  |  |  |  |  |  |  |  |  |  |  |  |  |  |  |  |  |  |  |  |  |  |  |  |  |  |  |  |  |  |  |  |  |  |  |  |  |  |  |  |  |  |  |  |  |
| Oct-16 | 4.7 |  |  |  |  |  |  |  |  |  |  |  |  |  |  |  |  |  |  |  |  |  |  |  |  |  |  |  |  |  |  |  |  |  |  |  |  |  |  |  |  |  |  |  |  |  |  |  |  |  |  |
| Nov-16 | 4.4 |  |  |  |  |  |  |  |  |  |  |  |  |  |  |  |  |  |  |  |  |  |  |  |  |  |  |  |  |  |  |  |  |  |  |  |  |  |  |  |  |  |  |  |  |  |  |  |  |  |  |
| Dec-16 | 4.5 |  |  |  |  |  |  |  |  |  |  |  |  |  |  |  |  |  |  |  |  |  |  |  |  |  |  |  |  |  |  |  |  |  |  |  |  |  |  |  |  |  |  |  |  |  |  |  |  |  |  |
| Jan-17 | 5.1 |  |  |  |  |  |  |  |  |  |  |  |  |  |  |  |  |  |  |  |  |  |  |  |  |  |  |  |  |  |  |  |  |  |  |  |  |  |  |  |  |  |  |  |  |  |  |  |  |  |  |
| Feb-17 | 4.9 |  |  |  |  |  |  |  |  |  |  |  |  |  |  |  |  |  |  |  |  |  |  |  |  |  |  |  |  |  |  |  |  |  |  |  |  |  |  |  |  |  |  |  |  |  |  |  |  |  |  |
| Mar-17 | 4.6 |  |  |  |  |  |  |  |  |  |  |  |  |  |  |  |  |  |  |  |  |  |  |  |  |  |  |  |  |  |  |  |  |  |  |  |  |  |  |  |  |  |  |  |  |  |  |  |  |  |  |
| Apr-17 | 4.1 |  |  |  |  |  |  |  |  |  |  |  |  |  |  |  |  |  |  |  |  |  |  |  |  |  |  |  |  |  |  |  |  |  |  |  |  |  |  |  |  |  |  |  |  |  |  |  |  |  |  |
| May-17 | 4.1 |  |  |  |  |  |  |  |  |  |  |  |  |  |  |  |  |  |  |  |  |  |  |  |  |  |  |  |  |  |  |  |  |  |  |  |  |  |  |  |  |  |  |  |  |  |  |  |  |  |  |
| Jun-17 | 4.5 |  |  |  |  |  |  |  |  |  |  |  |  |  |  |  |  |  |  |  |  |  |  |  |  |  |  |  |  |  |  |  |  |  |  |  |  |  |  |  |  |  |  |  |  |  |  |  |  |  |  |
| Jul-17 | 4.6 |  |  |  |  |  |  |  |  |  |  |  |  |  |  |  |  |  |  |  |  |  |  |  |  |  |  |  |  |  |  |  |  |  |  |  |  |  |  |  |  |  |  |  |  |  |  |  |  |  |  |
| Aug-17 | 4.5 |  |  |  |  |  |  |  |  |  |  |  |  |  |  |  |  |  |  |  |  |  |  |  |  |  |  |  |  |  |  |  |  |  |  |  |  |  |  |  |  |  |  |  |  |  |  |  |  |  |  |
| Sep-17 | 4.1 |  |  |  |  |  |  |  |  |  |  |  |  |  |  |  |  |  |  |  |  |  |  |  |  |  |  |  |  |  |  |  |  |  |  |  |  |  |  |  |  |  |  |  |  |  |  |  |  |  |  |
| Oct-17 | 3.9 |  |  |  |  |  |  |  |  |  |  |  |  |  |  |  |  |  |  |  |  |  |  |  |  |  |  |  |  |  |  |  |  |  |  |  |  |  |  |  |  |  |  |  |  |  |  |  |  |  |  |
| Nov-17 | 3.9 |  |  |  |  |  |  |  |  |  |  |  |  |  |  |  |  |  |  |  |  |  |  |  |  |  |  |  |  |  |  |  |  |  |  |  |  |  |  |  |  |  |  |  |  |  |  |  |  |  |  |
| Dec-17 | 3.9 |  |  |  |  |  |  |  |  |  |  |  |  |  |  |  |  |  |  |  |  |  |  |  |  |  |  |  |  |  |  |  |  |  |  |  |  |  |  |  |  |  |  |  |  |  |  |  |  |  |  |
| Jan-18 | 4.5 |  |  |  |  |  |  |  |  |  |  |  |  |  |  |  |  |  |  |  |  |  |  |  |  |  |  |  |  |  |  |  |  |  |  |  |  |  |  |  |  |  |  |  |  |  |  |  |  |  |  |
| Feb-18 | 4.4 |  |  |  |  |  |  |  |  |  |  |  |  |  |  |  |  |  |  |  |  |  |  |  |  |  |  |  |  |  |  |  |  |  |  |  |  |  |  |  |  |  |  |  |  |  |  |  |  |  |  |
| Mar-18 | 4.1 |  |  |  |  |  |  |  |  |  |  |  |  |  |  |  |  |  |  |  |  |  |  |  |  |  |  |  |  |  |  |  |  |  |  |  |  |  |  |  |  |  |  |  |  |  |  |  |  |  |  |
| Apr-18 | 3.7 |  |  |  |  |  |  |  |  |  |  |  |  |  |  |  |  |  |  |  |  |  |  |  |  |  |  |  |  |  |  |  |  |  |  |  |  |  |  |  |  |  |  |  |  |  |  |  |  |  |  |
| May-18 | 3.6 |  |  |  |  |  |  |  |  |  |  |  |  |  |  |  |  |  |  |  |  |  |  |  |  |  |  |  |  |  |  |  |  |  |  |  |  |  |  |  |  |  |  |  |  |  |  |  |  |  |  |
| Jun-18 | 4.2 |  |  |  |  |  |  |  |  |  |  |  |  |  |  |  |  |  |  |  |  |  |  |  |  |  |  |  |  |  |  |  |  |  |  |  |  |  |  |  |  |  |  |  |  |  |  |  |  |  |  |
| Jul-18 | 4.1 |  |  |  |  |  |  |  |  |  |  |  |  |  |  |  |  |  |  |  |  |  |  |  |  |  |  |  |  |  |  |  |  |  |  |  |  |  |  |  |  |  |  |  |  |  |  |  |  |  |  |
| Aug-18 | 3.9 |  |  |  |  |  |  |  |  |  |  |  |  |  |  |  |  |  |  |  |  |  |  |  |  |  |  |  |  |  |  |  |  |  |  |  |  |  |  |  |  |  |  |  |  |  |  |  |  |  |  |
| Sep-18 | 3.6 |  |  |  |  |  |  |  |  |  |  |  |  |  |  |  |  |  |  |  |  |  |  |  |  |  |  |  |  |  |  |  |  |  |  |  |  |  |  |  |  |  |  |  |  |  |  |  |  |  |  |
| Oct-18 | 3.5 |  |  |  |  |  |  |  |  |  |  |  |  |  |  |  |  |  |  |  |  |  |  |  |  |  |  |  |  |  |  |  |  |  |  |  |  |  |  |  |  |  |  |  |  |  |  |  |  |  |  |
| Nov-18 | 3.5 |  |  |  |  |  |  |  |  |  |  |  |  |  |  |  |  |  |  |  |  |  |  |  |  |  |  |  |  |  |  |  |  |  |  |  |  |  |  |  |  |  |  |  |  |  |  |  |  |  |  |
| Dec-18 | 3.7 |  |  |  |  |  |  |  |  |  |  |  |  |  |  |  |  |  |  |  |  |  |  |  |  |  |  |  |  |  |  |  |  |  |  |  |  |  |  |  |  |  |  |  |  |  |  |  |  |  |  |
| Jan-19 | 4.4 |  |  |  |  |  |  |  |  |  |  |  |  |  |  |  |  |  |  |  |  |  |  |  |  |  |  |  |  |  |  |  |  |  |  |  |  |  |  |  |  |  |  |  |  |  |  |  |  |  |  |
| Feb-19 | 4.1 |  |  |  |  |  |  |  |  |  |  |  |  |  |  |  |  |  |  |  |  |  |  |  |  |  |  |  |  |  |  |  |  |  |  |  |  |  |  |  |  |  |  |  |  |  |  |  |  |  |  |
| Mar-19 | 3.9 |  |  |  |  |  |  |  |  |  |  |  |  |  |  |  |  |  |  |  |  |  |  |  |  |  |  |  |  |  |  |  |  |  |  |  |  |  |  |  |  |  |  |  |  |  |  |  |  |  |  |
| Apr-19 | 3.3 |  |  |  |  |  |  |  |  |  |  |  |  |  |  |  |  |  |  |  |  |  |  |  |  |  |  |  |  |  |  |  |  |  |  |  |  |  |  |  |  |  |  |  |  |  |  |  |  |  |  |
| May-19 | 3.4 |  |  |  |  |  |  |  |  |  |  |  |  |  |  |  |  |  |  |  |  |  |  |  |  |  |  |  |  |  |  |  |  |  |  |  |  |  |  |  |  |  |  |  |  |  |  |  |  |  |  |
| Jun-19 | 3.8 |  |  |  |  |  |  |  |  |  |  |  |  |  |  |  |  |  |  |  |  |  |  |  |  |  |  |  |  |  |  |  |  |  |  |  |  |  |  |  |  |  |  |  |  |  |  |  |  |  |  |
| Jul-19 | 4 |  |  |  |  |  |  |  |  |  |  |  |  |  |  |  |  |  |  |  |  |  |  |  |  |  |  |  |  |  |  |  |  |  |  |  |  |  |  |  |  |  |  |  |  |  |  |  |  |  |  |
| Aug-19 | 3.8 |  |  |  |  |  |  |  |  |  |  |  |  |  |  |  |  |  |  |  |  |  |  |  |  |  |  |  |  |  |  |  |  |  |  |  |  |  |  |  |  |  |  |  |  |  |  |  |  |  |  |
| Sep-19 | 3.3 |  |  |  |  |  |  |  |  |  |  |  |  |  |  |  |  |  |  |  |  |  |  |  |  |  |  |  |  |  |  |  |  |  |  |  |  |  |  |  |  |  |  |  |  |  |  |  |  |  |  |
| Oct-19 | 3.3 |  |  |  |  |  |  |  |  |  |  |  |  |  |  |  |  |  |  |  |  |  |  |  |  |  |  |  |  |  |  |  |  |  |  |  |  |  |  |  |  |  |  |  |  |  |  |  |  |  |  |
| Nov-19 | 3.3 |  |  |  |  |  |  |  |  |  |  |  |  |  |  |  |  |  |  |  |  |  |  |  |  |  |  |  |  |  |  |  |  |  |  |  |  |  |  |  |  |  |  |  |  |  |  |  |  |  |  |
| Dec-19 | 3.4 |  |  |  |  |  |  |  |  |  |  |  |  |  |  |  |  |  |  |  |  |  |  |  |  |  |  |  |  |  |  |  |  |  |  |  |  |  |  |  |  |  |  |  |  |  |  |  |  |  |  |
| Jan-20 | 4 |  |  |  |  |  |  |  |  |  |  |  |  |  |  |  |  |  |  |  |  |  |  |  |  |  |  |  |  |  |  |  |  |  |  |  |  |  |  |  |  |  |  |  |  |  |  |  |  |  |  |
| Feb-20 | 3.8 |  |  |  |  |  |  |  |  |  |  |  |  |  |  |  |  |  |  |  |  |  |  |  |  |  |  |  |  |  |  |  |  |  |  |  |  |  |  |  |  |  |  |  |  |  |  |  |  |  |  |
| Mar-20 | 4.5 |  |  |  |  |  |  |  |  |  |  |  |  |  |  |  |  |  |  |  |  |  |  |  |  |  |  |  |  |  |  |  |  |  |  |  |  |  |  |  |  |  |  |  |  |  |  |  |  |  |  |
| Apr-20 | 14.4 |  |  |  |  |  |  |  |  |  |  |  |  |  |  |  |  |  |  |  |  |  |  |  |  |  |  |  |  |  |  |  |  |  |  |  |  |  |  |  |  |  |  |  |  |  |  |  |  |  |  |
| May-20 | 13 |  |  |  |  |  |  |  |  |  |  |  |  |  |  |  |  |  |  |  |  |  |  |  |  |  |  |  |  |  |  |  |  |  |  |  |  |  |  |  |  |  |  |  |  |  |  |  |  |  |  |
| Jun-20 | 11.2 |  |  |  |  |  |  |  |  |  |  |  |  |  |  |  |  |  |  |  |  |  |  |  |  |  |  |  |  |  |  |  |  |  |  |  |  |  |  |  |  |  |  |  |  |  |  |  |  |  |  |
| Jul-20 | 10.5 |  |  |  |  |  |  |  |  |  |  |  |  |  |  |  |  |  |  |  |  |  |  |  |  |  |  |  |  |  |  |  |  |  |  |  |  |  |  |  |  |  |  |  |  |  |  |  |  |  |  |
| Aug-20 | 8.5 |  |  |  |  |  |  |  |  |  |  |  |  |  |  |  |  |  |  |  |  |  |  |  |  |  |  |  |  |  |  |  |  |  |  |  |  |  |  |  |  |  |  |  |  |  |  |  |  |  |  |
| Sep-20 | 7.7 |  |  |  |  |  |  |  |  |  |  |  |  |  |  |  |  |  |  |  |  |  |  |  |  |  |  |  |  |  |  |  |  |  |  |  |  |  |  |  |  |  |  |  |  |  |  |  |  |  |  |
| Oct-20 | 6.6 |  |  |  |  |  |  |  |  |  |  |  |  |  |  |  |  |  |  |  |  |  |  |  |  |  |  |  |  |  |  |  |  |  |  |  |  |  |  |  |  |  |  |  |  |  |  |  |  |  |  |
| Nov-20 | 6.4 |  |  |  |  |  |  |  |  |  |  |  |  |  |  |  |  |  |  |  |  |  |  |  |  |  |  |  |  |  |  |  |  |  |  |  |  |  |  |  |  |  |  |  |  |  |  |  |  |  |  |
| Dec-20 | 6.5 |  |  |  |  |  |  |  |  |  |  |  |  |  |  |  |  |  |  |  |  |  |  |  |  |  |  |  |  |  |  |  |  |  |  |  |  |  |  |  |  |  |  |  |  |  |  |  |  |  |  |
| Jan-21 | 6.8 |  |  |  |  |  |  |  |  |  |  |  |  |  |  |  |  |  |  |  |  |  |  |  |  |  |  |  |  |  |  |  |  |  |  |  |  |  |  |  |  |  |  |  |  |  |  |  |  |  |  |
| Feb-21 | 6.6 |  |  |  |  |  |  |  |  |  |  |  |  |  |  |  |  |  |  |  |  |  |  |  |  |  |  |  |  |  |  |  |  |  |  |  |  |  |  |  |  |  |  |  |  |  |  |  |  |  |  |
| Mar-21 | 6.2 |  |  |  |  |  |  |  |  |  |  |  |  |  |  |  |  |  |  |  |  |  |  |  |  |  |  |  |  |  |  |  |  |  |  |  |  |  |  |  |  |  |  |  |  |  |  |  |  |  |  |
| Apr-21 | 5.7 |  |  |  |  |  |  |  |  |  |  |  |  |  |  |  |  |  |  |  |  |  |  |  |  |  |  |  |  |  |  |  |  |  |  |  |  |  |  |  |  |  |  |  |  |  |  |  |  |  |  |
| May-21 | 5.5 |  |  |  |  |  |  |  |  |  |  |  |  |  |  |  |  |  |  |  |  |  |  |  |  |  |  |  |  |  |  |  |  |  |  |  |  |  |  |  |  |  |  |  |  |  |  |  |  |  |  |
| Jun-21 | 6.1 |  |  |  |  |  |  |  |  |  |  |  |  |  |  |  |  |  |  |  |  |  |  |  |  |  |  |  |  |  |  |  |  |  |  |  |  |  |  |  |  |  |  |  |  |  |  |  |  |  |  |
| Jul-21 | 5.7 |  |  |  |  |  |  |  |  |  |  |  |  |  |  |  |  |  |  |  |  |  |  |  |  |  |  |  |  |  |  |  |  |  |  |  |  |  |  |  |  |  |  |  |  |  |  |  |  |  |  |
| Aug-21 | 5.3 |  |  |  |  |  |  |  |  |  |  |  |  |  |  |  |  |  |  |  |  |  |  |  |  |  |  |  |  |  |  |  |  |  |  |  |  |  |  |  |  |  |  |  |  |  |  |  |  |  |  |
| Sep-21 | 4.6 |  |  |  |  |  |  |  |  |  |  |  |  |  |  |  |  |  |  |  |  |  |  |  |  |  |  |  |  |  |  |  |  |  |  |  |  |  |  |  |  |  |  |  |  |  |  |  |  |  |  |
| Oct-21 | 4.3 |  |  |  |  |  |  |  |  |  |  |  |  |  |  |  |  |  |  |  |  |  |  |  |  |  |  |  |  |  |  |  |  |  |  |  |  |  |  |  |  |  |  |  |  |  |  |  |  |  |  |
| Nov-21 | 3.9 |  |  |  |  |  |  |  |  |  |  |  |  |  |  |  |  |  |  |  |  |  |  |  |  |  |  |  |  |  |  |  |  |  |  |  |  |  |  |  |  |  |  |  |  |  |  |  |  |  |  |
| Dec-21 | 3.7 |  |  |  |  |  |  |  |  |  |  |  |  |  |  |  |  |  |  |  |  |  |  |  |  |  |  |  |  |  |  |  |  |  |  |  |  |  |  |  |  |  |  |  |  |  |  |  |  |  |  |
| Jan-22 | 4.4 |  |  |  |  |  |  |  |  |  |  |  |  |  |  |  |  |  |  |  |  |  |  |  |  |  |  |  |  |  |  |  |  |  |  |  |  |  |  |  |  |  |  |  |  |  |  |  |  |  |  |
| Feb-22 | 4.1 |  |  |  |  |  |  |  |  |  |  |  |  |  |  |  |  |  |  |  |  |  |  |  |  |  |  |  |  |  |  |  |  |  |  |  |  |  |  |  |  |  |  |  |  |  |  |  |  |  |  |
| Mar-22 | 3.8 |  |  |  |  |  |  |  |  |  |  |  |  |  |  |  |  |  |  |  |  |  |  |  |  |  |  |  |  |  |  |  |  |  |  |  |  |  |  |  |  |  |  |  |  |  |  |  |  |  |  |
| Apr-22 | 3.3 |  |  |  |  |  |  |  |  |  |  |  |  |  |  |  |  |  |  |  |  |  |  |  |  |  |  |  |  |  |  |  |  |  |  |  |  |  |  |  |  |  |  |  |  |  |  |  |  |  |  |
| May-22 | 3.4 |  |  |  |  |  |  |  |  |  |  |  |  |  |  |  |  |  |  |  |  |  |  |  |  |  |  |  |  |  |  |  |  |  |  |  |  |  |  |  |  |  |  |  |  |  |  |  |  |  |  |
| Jun-22 | 3.8 |  |  |  |  |  |  |  |  |  |  |  |  |  |  |  |  |  |  |  |  |  |  |  |  |  |  |  |  |  |  |  |  |  |  |  |  |  |  |  |  |  |  |  |  |  |  |  |  |  |  |
| Jul-22 | 3.8 |  |  |  |  |  |  |  |  |  |  |  |  |  |  |  |  |  |  |  |  |  |  |  |  |  |  |  |  |  |  |  |  |  |  |  |  |  |  |  |  |  |  |  |  |  |  |  |  |  |  |
| Aug-22 | 3.8 |  |  |  |  |  |  |  |  |  |  |  |  |  |  |  |  |  |  |  |  |  |  |  |  |  |  |  |  |  |  |  |  |  |  |  |  |  |  |  |  |  |  |  |  |  |  |  |  |  |  |
| Sep-22 | 3.3 |  |  |  |  |  |  |  |  |  |  |  |  |  |  |  |  |  |  |  |  |  |  |  |  |  |  |  |  |  |  |  |  |  |  |  |  |  |  |  |  |  |  |  |  |  |  |  |  |  |  |
| Oct-22 | 3.4 |  |  |  |  |  |  |  |  |  |  |  |  |  |  |  |  |  |  |  |  |  |  |  |  |  |  |  |  |  |  |  |  |  |  |  |  |  |  |  |  |  |  |  |  |  |  |  |  |  |  |
| Nov-22 | 3.4 |  |  |  |  |  |  |  |  |  |  |  |  |  |  |  |  |  |  |  |  |  |  |  |  |  |  |  |  |  |  |  |  |  |  |  |  |  |  |  |  |  |  |  |  |  |  |  |  |  |  |
| Dec-22 | 3.3 |  |  |  |  |  |  |  |  |  |  |  |  |  |  |  |  |  |  |  |  |  |  |  |  |  |  |  |  |  |  |  |  |  |  |  |  |  |  |  |  |  |  |  |  |  |  |  |  |  |  |
| Jan-23 | 3.9 |  |  |  |  |  |  |  |  |  |  |  |  |  |  |  |  |  |  |  |  |  |  |  |  |  |  |  |  |  |  |  |  |  |  |  |  |  |  |  |  |  |  |  |  |  |  |  |  |  |  |
| Feb-23 | 3.9 |  |  |  |  |  |  |  |  |  |  |  |  |  |  |  |  |  |  |  |  |  |  |  |  |  |  |  |  |  |  |  |  |  |  |  |  |  |  |  |  |  |  |  |  |  |  |  |  |  |  |
| Mar-23 | 3.6 |  |  |  |  |  |  |  |  |  |  |  |  |  |  |  |  |  |  |  |  |  |  |  |  |  |  |  |  |  |  |  |  |  |  |  |  |  |  |  |  |  |  |  |  |  |  |  |  |  |  |
| Apr-23 | 3.1 |  |  |  |  |  |  |  |  |  |  |  |  |  |  |  |  |  |  |  |  |  |  |  |  |  |  |  |  |  |  |  |  |  |  |  |  |  |  |  |  |  |  |  |  |  |  |  |  |  |  |
| May-23 | 3.4 |  |  |  |  |  |  |  |  |  |  |  |  |  |  |  |  |  |  |  |  |  |  |  |  |  |  |  |  |  |  |  |  |  |  |  |  |  |  |  |  |  |  |  |  |  |  |  |  |  |  |
| Jun-23 | 3.8 |  |  |  |  |  |  |  |  |  |  |  |  |  |  |  |  |  |  |  |  |  |  |  |  |  |  |  |  |  |  |  |  |  |  |  |  |  |  |  |  |  |  |  |  |  |  |  |  |  |  |
| Jul-23 | 3.8 |  |  |  |  |  |  |  |  |  |  |  |  |  |  |  |  |  |  |  |  |  |  |  |  |  |  |  |  |  |  |  |  |  |  |  |  |  |  |  |  |  |  |  |  |  |  |  |  |  |  |
| Aug-23 | 3.9 |  |  |  |  |  |  |  |  |  |  |  |  |  |  |  |  |  |  |  |  |  |  |  |  |  |  |  |  |  |  |  |  |  |  |  |  |  |  |  |  |  |  |  |  |  |  |  |  |  |  |
| Sep-23 | 3.6 |  |  |  |  |  |  |  |  |  |  |  |  |  |  |  |  |  |  |  |  |  |  |  |  |  |  |  |  |  |  |  |  |  |  |  |  |  |  |  |  |  |  |  |  |  |  |  |  |  |  |
| Oct-23 | 3.6 |  |  |  |  |  |  |  |  |  |  |  |  |  |  |  |  |  |  |  |  |  |  |  |  |  |  |  |  |  |  |  |  |  |  |  |  |  |  |  |  |  |  |  |  |  |  |  |  |  |  |
| Nov-23 | 3.5 |  |  |  |  |  |  |  |  |  |  |  |  |  |  |  |  |  |  |  |  |  |  |  |  |  |  |  |  |  |  |  |  |  |  |  |  |  |  |  |  |  |  |  |  |  |  |  |  |  |  |
| Dec-23 | 3.5 |  |  |  |  |  |  |  |  |  |  |  |  |  |  |  |  |  |  |  |  |  |  |  |  |  |  |  |  |  |  |  |  |  |  |  |  |  |  |  |  |  |  |  |  |  |  |  |  |  |  |
| Jan-24 | 4.1 |  |  |  |  |  |  |  |  |  |  |  |  |  |  |  |  |  |  |  |  |  |  |  |  |  |  |  |  |  |  |  |  |  |  |  |  |  |  |  |  |  |  |  |  |  |  |  |  |  |  |
| Feb-24 | 4.2 |  |  |  |  |  |  |  |  |  |  |  |  |  |  |  |  |  |  |  |  |  |  |  |  |  |  |  |  |  |  |  |  |  |  |  |  |  |  |  |  |  |  |  |  |  |  |  |  |  |  |
| Mar-24 | 3.9 |  |  |  |  |  |  |  |  |  |  |  |  |  |  |  |  |  |  |  |  |  |  |  |  |  |  |  |  |  |  |  |  |  |  |  |  |  |  |  |  |  |  |  |  |  |  |  |  |  |  |
| Apr-24 | 3.5 |  |  |  |  |  |  |  |  |  |  |  |  |  |  |  |  |  |  |  |  |  |  |  |  |  |  |  |  |  |  |  |  |  |  |  |  |  |  |  |  |  |  |  |  |  |  |  |  |  |  |
| May-24 | 3.7 |  |  |  |  |  |  |  |  |  |  |  |  |  |  |  |  |  |  |  |  |  |  |  |  |  |  |  |  |  |  |  |  |  |  |  |  |  |  |  |  |  |  |  |  |  |  |  |  |  |  |
| Jun-24 | 4.3 |  |  |  |  |  |  |  |  |  |  |  |  |  |  |  |  |  |  |  |  |  |  |  |  |  |  |  |  |  |  |  |  |  |  |  |  |  |  |  |  |  |  |  |  |  |  |  |  |  |  |